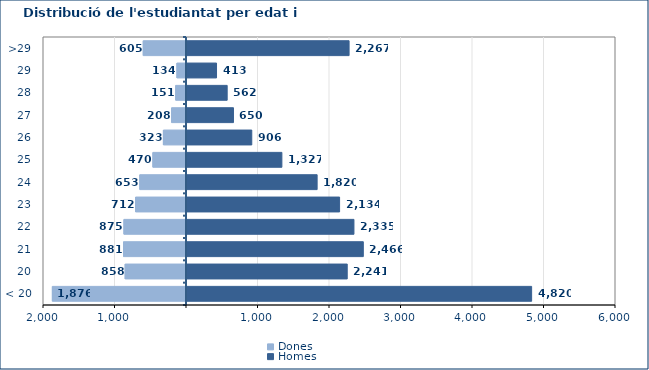
| Category | Dones | Homes |
|---|---|---|
| < 20 | -1876 | 4820 |
| 20 | -858 | 2241 |
| 21 | -881 | 2466 |
| 22 | -875 | 2335 |
| 23 | -712 | 2134 |
| 24 | -653 | 1820 |
| 25 | -470 | 1327 |
| 26 | -323 | 906 |
| 27 | -208 | 650 |
| 28 | -151 | 562 |
| 29 | -134 | 413 |
| >29 | -605 | 2267 |